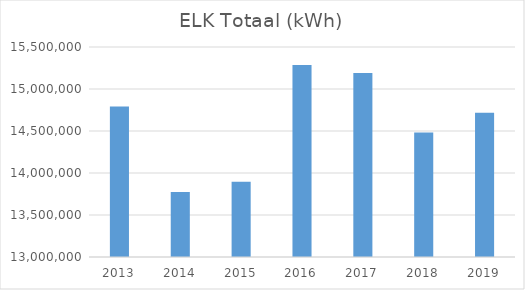
| Category | ELK Totaal (kWh) |
|---|---|
| 2013.0 | 14791405 |
| 2014.0 | 13772545 |
| 2015.0 | 13896009 |
| 2016.0 | 15284848 |
| 2017.0 | 15190786 |
| 2018.0 | 14481459 |
| 2019.0 | 14716389 |